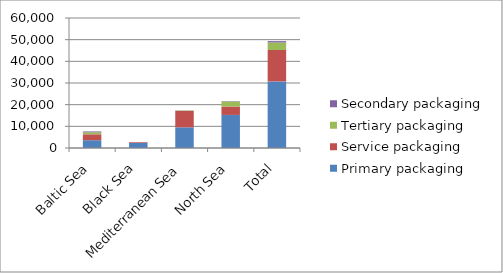
| Category | Primary packaging | Service packaging | Tertiary packaging | Secondary packaging |
|---|---|---|---|---|
| Baltic Sea | 3588 | 2734 | 937 | 387 |
| Black Sea | 2335 | 329 | 0 | 12 |
| Mediterranean Sea | 9547 | 7551 | 200 | 73 |
| North Sea | 15265 | 3885 | 2319 | 167 |
| Total | 30735 | 14499 | 3456 | 639 |